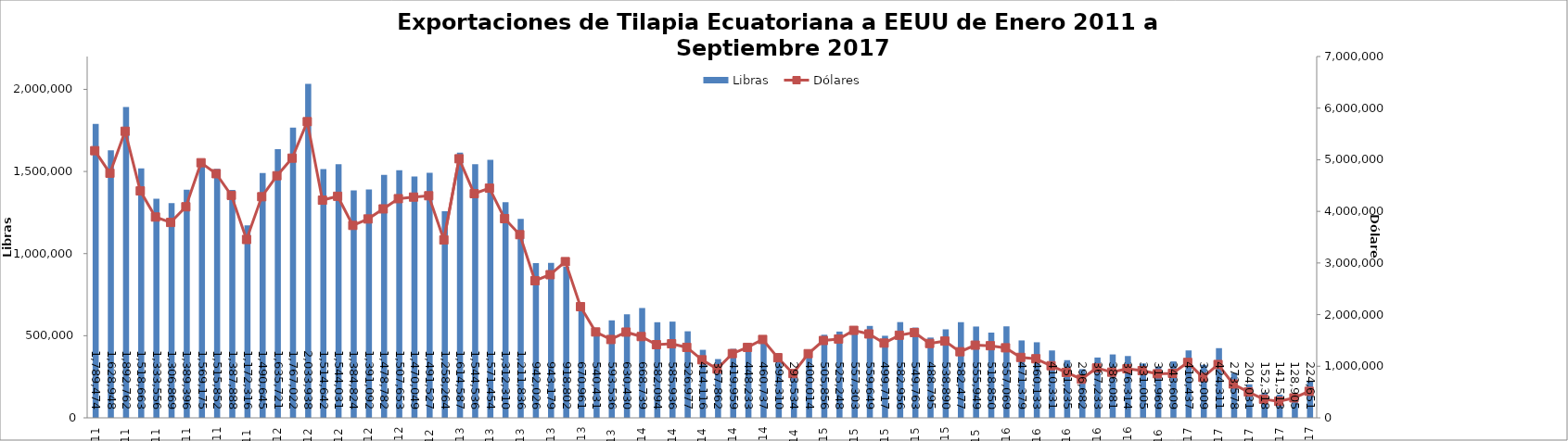
| Category | Libras  |
|---|---|
| 2011-01-01 | 1789473.82 |
| 2011-02-01 | 1628948.076 |
| 2011-03-01 | 1892761.535 |
| 2011-04-01 | 1518662.961 |
| 2011-05-01 | 1333555.926 |
| 2011-06-01 | 1306869.243 |
| 2011-07-01 | 1389396.24 |
| 2011-08-01 | 1569174.756 |
| 2011-09-01 | 1515852.096 |
| 2011-10-01 | 1387888.293 |
| 2011-11-01 | 1172315.891 |
| 2011-12-01 | 1490644.699 |
| 2012-01-01 | 1635720.607 |
| 2012-02-01 | 1767022.174 |
| 2012-03-01 | 2033937.505 |
| 2012-04-01 | 1514641.77 |
| 2012-05-01 | 1544031.293 |
| 2012-06-01 | 1384823.899 |
| 2012-07-01 | 1391091.577 |
| 2012-08-01 | 1478781.747 |
| 2012-09-01 | 1507653.188 |
| 2012-10-01 | 1470049.326 |
| 2012-11-01 | 1491526.539 |
| 2012-12-01 | 1258264 |
| 2013-01-01 | 1614587 |
| 2013-02-01 | 1544536.146 |
| 2013-03-01 | 1571454.312 |
| 2013-04-01 | 1312310.196 |
| 2013-05-01 | 1211835.551 |
| 2013-06-01 | 942025.58 |
| 2013-07-01 | 943178.586 |
| 2013-08-01 | 918802.324 |
| 2013-09-01 | 670961.192 |
| 2013-10-01 | 540431.235 |
| 2013-11-01 | 593535.64 |
| 2013-12-01 | 630429.621 |
| 2014-01-01 | 668739 |
| 2014-02-01 | 582093.766 |
| 2014-03-01 | 585936.383 |
| 2014-04-01 | 526976.561 |
| 2014-05-01 | 414116.473 |
| 2014-06-01 | 357861.695 |
| 2014-07-01 | 419958.663 |
| 2014-08-01 | 448233 |
| 2014-09-01 | 460737.149 |
| 2014-10-01 | 394310.347 |
| 2014-11-01 | 293533.672 |
| 2014-12-01 | 400013.647 |
| 2015-01-01 | 505856.493 |
| 2015-02-01 | 525248 |
| 2015-03-01 | 557303.039 |
| 2015-04-01 | 559648.733 |
| 2015-05-01 | 499716.682 |
| 2015-06-01 | 582955.764 |
| 2015-07-01 | 549763.307 |
| 2015-08-01 | 488795.094 |
| 2015-09-01 | 538890.219 |
| 2015-10-01 | 582477.366 |
| 2015-11-01 | 555949.414 |
| 2015-12-01 | 518850.405 |
| 2016-01-01 | 557069.351 |
| 2016-02-01 | 471378.754 |
| 2016-03-01 | 460133.089 |
| 2016-04-01 | 410331.175 |
| 2016-05-01 | 351235 |
| 2016-06-01 | 296682 |
| 2016-07-01 | 367233.45 |
| 2016-08-01 | 386080.575 |
| 2016-09-01 | 376314.197 |
| 2016-10-01 | 331005.258 |
| 2016-11-01 | 311968.537 |
| 2016-12-01 | 343608.956 |
| 2017-01-01 | 410436.996 |
| 2017-02-01 | 323009.174 |
| 2017-03-01 | 424310.544 |
| 2017-04-01 | 273577.632 |
| 2017-05-01 | 204031.321 |
| 2017-06-01 | 152318.019 |
| 2017-07-01 | 141513.274 |
| 2017-08-01 | 128905.167 |
| 2017-09-01 | 224650.945 |